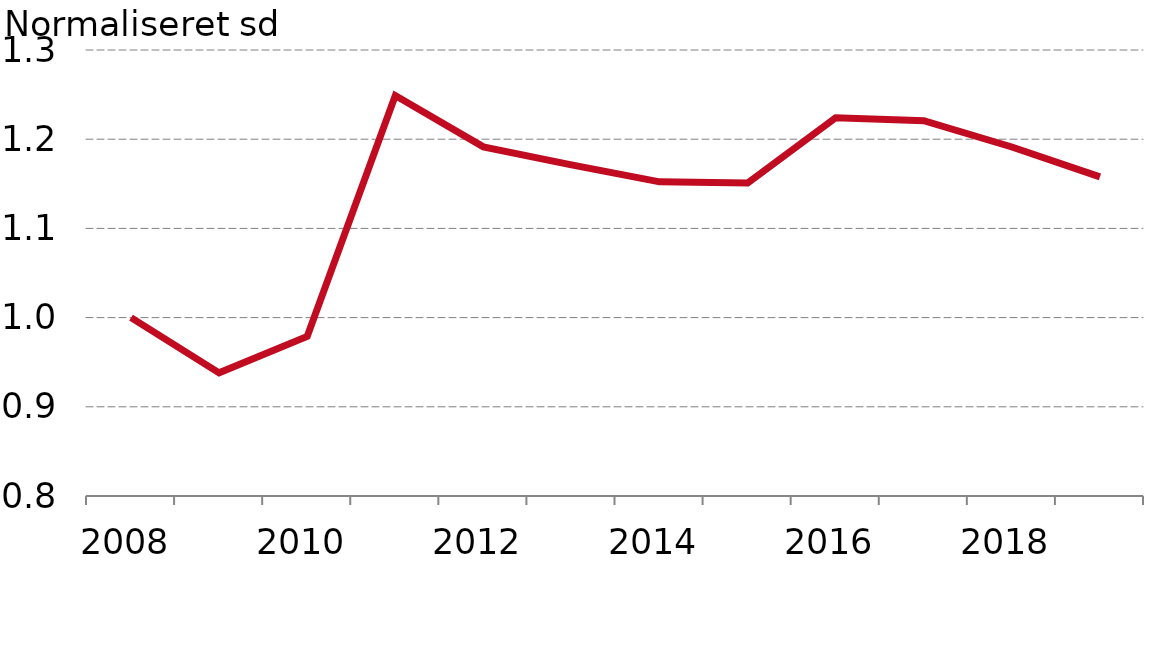
| Category |  Fritid |
|---|---|
| 2008.0 | 1 |
| 2009.0 | 0.938 |
| 2010.0 | 0.979 |
| 2011.0 | 1.249 |
| 2012.0 | 1.191 |
| 2013.0 | 1.171 |
| 2014.0 | 1.152 |
| 2015.0 | 1.151 |
| 2016.0 | 1.224 |
| 2017.0 | 1.221 |
| 2018.0 | 1.191 |
| 2019.0 | 1.158 |